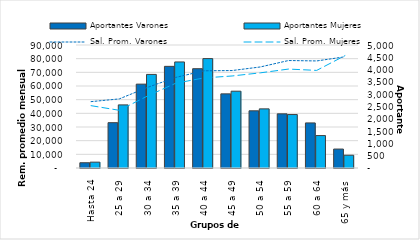
| Category | Aportantes Varones | Aportantes Mujeres |
|---|---|---|
| Hasta 24 | 214 | 238 |
| 25 a 29 | 1842 | 2565 |
| 30 a 34 | 3409 | 3804 |
| 35 a 39 | 4132 | 4311 |
| 40 a 44 | 4037 | 4447 |
| 45 a 49 | 3014 | 3122 |
| 50 a 54 | 2325 | 2404 |
| 55 a 59 | 2202 | 2173 |
| 60 a 64 | 1832 | 1318 |
| 65 y más | 770 | 519 |